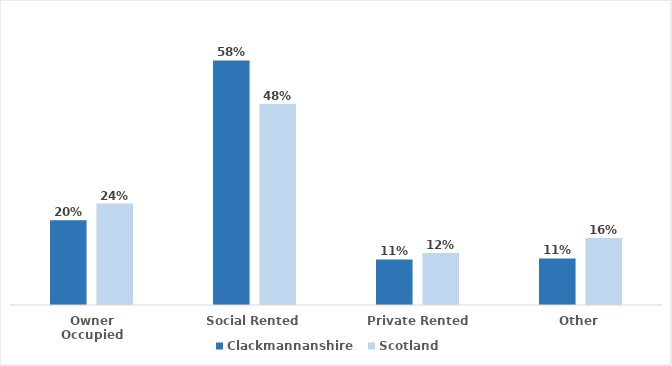
| Category | Clackmannanshire | Scotland |
|---|---|---|
| Owner Occupied | 0.201 | 0.241 |
| Social Rented | 0.58 | 0.477 |
| Private Rented | 0.108 | 0.123 |
| Other | 0.111 | 0.159 |